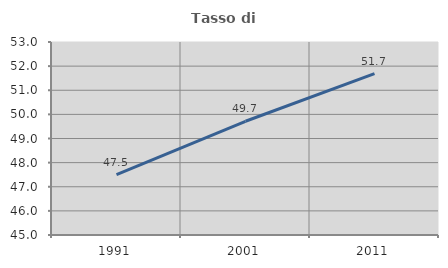
| Category | Tasso di occupazione   |
|---|---|
| 1991.0 | 47.506 |
| 2001.0 | 49.714 |
| 2011.0 | 51.691 |